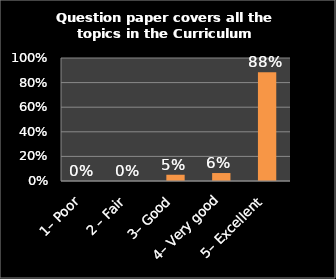
| Category | Series 0 |
|---|---|
| 1– Poor | 0 |
| 2 – Fair | 0 |
| 3– Good | 0.051 |
| 4– Very good | 0.065 |
| 5– Excellent | 0.884 |